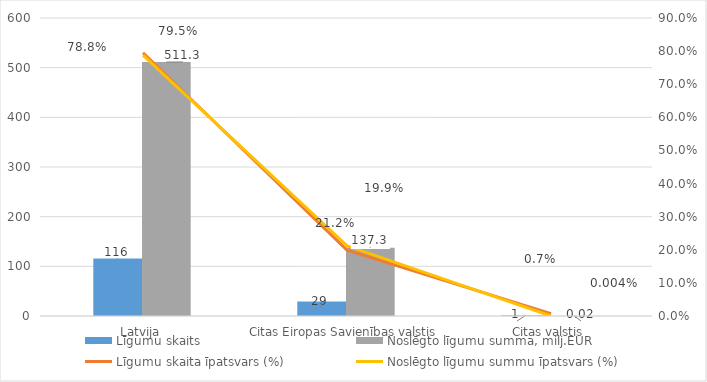
| Category | Līgumu skaits | Noslēgto līgumu summa, milj.EUR |
|---|---|---|
| Latvija | 116 | 511.3 |
| Citas Eiropas Savienības valstis | 29 | 137.3 |
| Citas valstis | 1 | 0.02 |